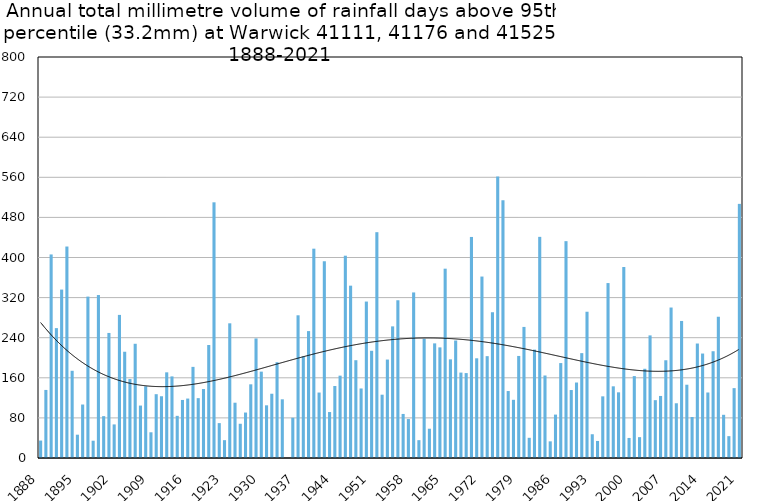
| Category | Annual total mm in days above 95th percentile |
|---|---|
| 1888 | 34.8 |
| 1889 | 135.8 |
| 1890 | 406.1 |
| 1891 | 259.1 |
| 1892 | 336 |
| 1893 | 421.9 |
| 1894 | 174 |
| 1895 | 46.5 |
| 1896 | 106.7 |
| 1897 | 322 |
| 1898 | 34.5 |
| 1899 | 325.1 |
| 1900 | 83.5 |
| 1901 | 249.5 |
| 1902 | 67 |
| 1903 | 285.5 |
| 1904 | 212 |
| 1905 | 157.5 |
| 1906 | 227.9 |
| 1907 | 104.6 |
| 1908 | 143 |
| 1909 | 51.3 |
| 1910 | 127.3 |
| 1911 | 123.2 |
| 1912 | 170.9 |
| 1913 | 162.8 |
| 1914 | 84.1 |
| 1915 | 115.8 |
| 1916 | 118.6 |
| 1917 | 181.8 |
| 1918 | 119.4 |
| 1919 | 137.6 |
| 1920 | 225.4 |
| 1921 | 510.1 |
| 1922 | 69.6 |
| 1923 | 35.6 |
| 1924 | 268.7 |
| 1925 | 110.3 |
| 1926 | 68.3 |
| 1927 | 90.7 |
| 1928 | 147 |
| 1929 | 238.5 |
| 1930 | 172.3 |
| 1931 | 105.1 |
| 1932 | 128.2 |
| 1933 | 191.1 |
| 1934 | 117.1 |
| 1935 | 0 |
| 1936 | 80.3 |
| 1937 | 284.7 |
| 1938 | 202.7 |
| 1939 | 253.2 |
| 1940 | 417.6 |
| 1941 | 130.6 |
| 1942 | 392.5 |
| 1943 | 91.7 |
| 1944 | 143.7 |
| 1945 | 164.3 |
| 1946 | 403.6 |
| 1947 | 343.8 |
| 1948 | 195.1 |
| 1949 | 138.7 |
| 1950 | 312.1 |
| 1951 | 213.9 |
| 1952 | 450.5 |
| 1953 | 126.3 |
| 1954 | 196.4 |
| 1955 | 262.6 |
| 1956 | 314.7 |
| 1957 | 87.9 |
| 1958 | 77.7 |
| 1959 | 330.3 |
| 1960 | 35.6 |
| 1961 | 237.9 |
| 1962 | 58.4 |
| 1963 | 228.7 |
| 1964 | 220.7 |
| 1965 | 377.7 |
| 1966 | 196.8 |
| 1967 | 234.4 |
| 1968 | 170.4 |
| 1969 | 169.4 |
| 1970 | 441 |
| 1971 | 198.9 |
| 1972 | 362 |
| 1973 | 203.2 |
| 1974 | 290.8 |
| 1975 | 561.8 |
| 1976 | 514.2 |
| 1977 | 133.6 |
| 1978 | 116.1 |
| 1979 | 203.6 |
| 1980 | 261.5 |
| 1981 | 40.3 |
| 1982 | 216.2 |
| 1983 | 441.2 |
| 1984 | 164.6 |
| 1985 | 33.2 |
| 1986 | 86.6 |
| 1987 | 189.4 |
| 1988 | 432.6 |
| 1989 | 135.6 |
| 1990 | 150.6 |
| 1991 | 209.2 |
| 1992 | 291.8 |
| 1993 | 47.4 |
| 1994 | 34 |
| 1995 | 123 |
| 1996 | 349 |
| 1997 | 143 |
| 1998 | 131 |
| 1999 | 381 |
| 2000 | 40 |
| 2001 | 163.4 |
| 2002 | 41.6 |
| 2003 | 178 |
| 2004 | 244.6 |
| 2005 | 115.4 |
| 2006 | 123.8 |
| 2007 | 195 |
| 2008 | 300.2 |
| 2009 | 109.2 |
| 2010 | 273.4 |
| 2011 | 146.2 |
| 2012 | 81.8 |
| 2013 | 228.4 |
| 2014 | 208.4 |
| 2015 | 130.7 |
| 2016 | 213 |
| 2017 | 281.8 |
| 2018 | 86.2 |
| 2019 | 43.6 |
| 2020 | 139.4 |
| 2021 | 507 |